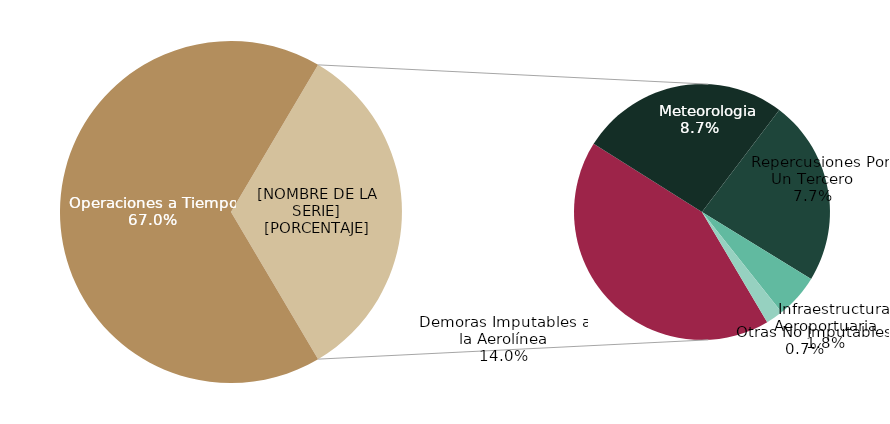
| Category | Demoras |
|---|---|
| Operaciones a Tiempo | 275500 |
| Demoras Imputables a la Aerolínea | 57545 |
|    Meteorologia | 35771 |
|    Repercusiones Por Un Tercero | 31781 |
|    Infraestructura Aeroportuaria | 7558 |
|    Otras No Imputables | 2930 |